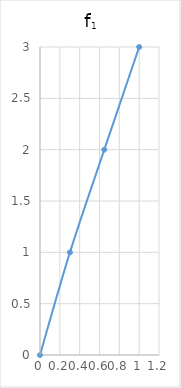
| Category | f1 |
|---|---|
| 0.0 | 0 |
| 0.3018499535840108 | 1 |
| 0.6485352721816373 | 2 |
| 1.0 | 3 |